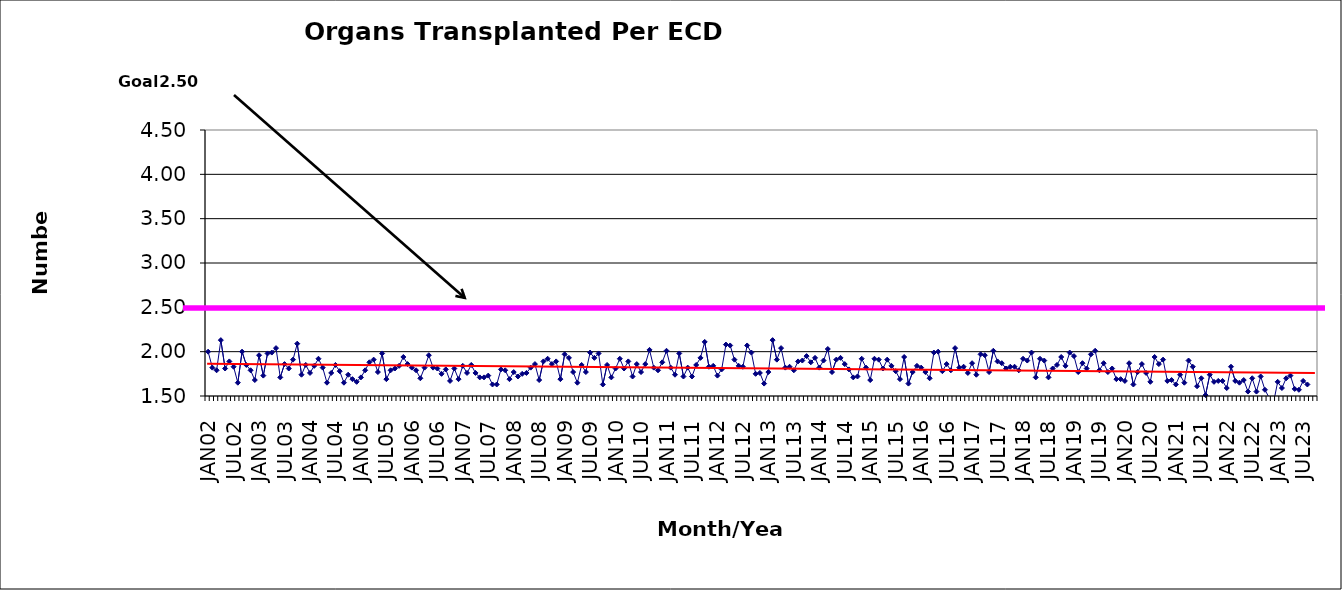
| Category | Series 0 |
|---|---|
| JAN02 | 2 |
| FEB02 | 1.82 |
| MAR02 | 1.79 |
| APR02 | 2.13 |
| MAY02 | 1.81 |
| JUN02 | 1.89 |
| JUL02 | 1.83 |
| AUG02 | 1.65 |
| SEP02 | 2 |
| OCT02 | 1.85 |
| NOV02 | 1.79 |
| DEC02 | 1.68 |
| JAN03 | 1.96 |
| FEB03 | 1.73 |
| MAR03 | 1.98 |
| APR03 | 1.99 |
| MAY03 | 2.04 |
| JUN03 | 1.71 |
| JUL03 | 1.86 |
| AUG03 | 1.81 |
| SEP03 | 1.91 |
| OCT03 | 2.09 |
| NOV03 | 1.74 |
| DEC03 | 1.85 |
| JAN04 | 1.76 |
| FEB04 | 1.84 |
| MAR04 | 1.92 |
| APR04 | 1.82 |
| MAY04 | 1.65 |
| JUN04 | 1.76 |
| JUL04 | 1.85 |
| AUG04 | 1.78 |
| SEP04 | 1.65 |
| OCT04 | 1.74 |
| NOV04 | 1.69 |
| DEC04 | 1.66 |
| JAN05 | 1.71 |
| FEB05 | 1.79 |
| MAR05 | 1.88 |
| APR05 | 1.91 |
| MAY05 | 1.77 |
| JUN05 | 1.98 |
| JUL05 | 1.69 |
| AUG05 | 1.79 |
| SEP05 | 1.81 |
| OCT05 | 1.84 |
| NOV05 | 1.94 |
| DEC05 | 1.86 |
| JAN06 | 1.82 |
| FEB06 | 1.79 |
| MAR06 | 1.7 |
| APR06 | 1.82 |
| MAY06 | 1.96 |
| JUN06 | 1.82 |
| JUL06 | 1.81 |
| AUG06 | 1.75 |
| SEP06 | 1.8 |
| OCT06 | 1.67 |
| NOV06 | 1.81 |
| DEC06 | 1.69 |
| JAN07 | 1.84 |
| FEB07 | 1.76 |
| MAR07 | 1.85 |
| APR07 | 1.76 |
| MAY07 | 1.71 |
| JUN07 | 1.71 |
| JUL07 | 1.73 |
| AUG07 | 1.63 |
| SEP07 | 1.63 |
| OCT07 | 1.8 |
| NOV07 | 1.79 |
| DEC07 | 1.69 |
| JAN08 | 1.77 |
| FEB08 | 1.72 |
| MAR08 | 1.75 |
| APR08 | 1.76 |
| MAY08 | 1.82 |
| JUN08 | 1.86 |
| JUL08 | 1.68 |
| AUG08 | 1.89 |
| SEP08 | 1.92 |
| OCT08 | 1.86 |
| NOV08 | 1.89 |
| DEC08 | 1.69 |
| JAN09 | 1.97 |
| FEB09 | 1.93 |
| MAR09 | 1.77 |
| APR09 | 1.65 |
| MAY09 | 1.85 |
| JUN09 | 1.77 |
| JUL09 | 1.99 |
| AUG09 | 1.93 |
| SEP09 | 1.98 |
| OCT09 | 1.63 |
| NOV09 | 1.85 |
| DEC09 | 1.71 |
| JAN10 | 1.81 |
| FEB10 | 1.92 |
| MAR10 | 1.81 |
| APR10 | 1.89 |
| MAY10 | 1.72 |
| JUN10 | 1.86 |
| JUL10 | 1.77 |
| AUG10 | 1.86 |
| SEP10 | 2.02 |
| OCT10 | 1.82 |
| NOV10 | 1.79 |
| DEC10 | 1.88 |
| JAN11 | 2.01 |
| FEB11 | 1.82 |
| MAR11 | 1.74 |
| APR11 | 1.98 |
| MAY11 | 1.72 |
| JUN11 | 1.82 |
| JUL11 | 1.72 |
| AUG11 | 1.85 |
| SEP11 | 1.93 |
| OCT11 | 2.11 |
| NOV11 | 1.83 |
| DEC11 | 1.84 |
| JAN12 | 1.73 |
| FEB12 | 1.8 |
| MAR12 | 2.08 |
| APR12 | 2.07 |
| MAY12 | 1.91 |
| JUN12 | 1.84 |
| JUL12 | 1.83 |
| AUG12 | 2.07 |
| SEP12 | 1.99 |
| OCT12 | 1.75 |
| NOV12 | 1.76 |
| DEC12 | 1.64 |
| JAN13 | 1.77 |
| FEB13 | 2.13 |
| MAR13 | 1.91 |
| APR13 | 2.04 |
| MAY13 | 1.82 |
| JUN13 | 1.83 |
| JUL13 | 1.79 |
| AUG13 | 1.89 |
| SEP13 | 1.9 |
| OCT13 | 1.95 |
| NOV13 | 1.88 |
| DEC13 | 1.93 |
| JAN14 | 1.82 |
| FEB14 | 1.9 |
| MAR14 | 2.03 |
| APR14 | 1.77 |
| MAY14 | 1.91 |
| JUN14 | 1.93 |
| JUL14 | 1.86 |
| AUG14 | 1.8 |
| SEP14 | 1.71 |
| OCT14 | 1.72 |
| NOV14 | 1.92 |
| DEC14 | 1.82 |
| JAN15 | 1.68 |
| FEB15 | 1.92 |
| MAR15 | 1.91 |
| APR15 | 1.81 |
| MAY15 | 1.91 |
| JUN15 | 1.84 |
| JUL15 | 1.78 |
| AUG15 | 1.69 |
| SEP15 | 1.94 |
| OCT15 | 1.64 |
| NOV15 | 1.77 |
| DEC15 | 1.84 |
| JAN16 | 1.82 |
| FEB16 | 1.77 |
| MAR16 | 1.7 |
| APR16 | 1.99 |
| MAY16 | 2 |
| JUN16 | 1.78 |
| JUL16 | 1.86 |
| AUG16 | 1.79 |
| SEP16 | 2.04 |
| OCT16 | 1.82 |
| NOV16 | 1.83 |
| DEC16 | 1.76 |
| JAN17 | 1.87 |
| FEB17 | 1.74 |
| MAR17 | 1.97 |
| APR17 | 1.96 |
| MAY17 | 1.77 |
| JUN17 | 2.01 |
| JUL17 | 1.89 |
| AUG17 | 1.87 |
| SEP17 | 1.81 |
| OCT17 | 1.83 |
| NOV17 | 1.83 |
| DEC17 | 1.79 |
| JAN18 | 1.92 |
| FEB18 | 1.9 |
| MAR18 | 1.99 |
| APR18 | 1.71 |
| MAY18 | 1.92 |
| JUN18 | 1.9 |
| JUL18 | 1.71 |
| AUG18 | 1.81 |
| SEP18 | 1.85 |
| OCT18 | 1.94 |
| NOV18 | 1.84 |
| DEC18 | 1.99 |
| JAN19 | 1.95 |
| FEB19 | 1.77 |
| MAR19 | 1.87 |
| APR19 | 1.81 |
| MAY19 | 1.97 |
| JUN19 | 2.01 |
| JUL19 | 1.79 |
| AUG19 | 1.87 |
| SEP19 | 1.77 |
| OCT19 | 1.81 |
| NOV19 | 1.69 |
| DEC19 | 1.69 |
| JAN20 | 1.67 |
| FEB20 | 1.87 |
| MAR20 | 1.63 |
| APR20 | 1.77 |
| MAY20 | 1.86 |
| JUN20 | 1.76 |
| JUL20 | 1.66 |
| AUG20 | 1.94 |
| SEP20 | 1.86 |
| OCT20 | 1.91 |
| NOV20 | 1.67 |
| DEC20 | 1.68 |
| JAN21 | 1.63 |
| FEB21 | 1.74 |
| MAR21 | 1.65 |
| APR21 | 1.9 |
| MAY21 | 1.83 |
| JUN21 | 1.61 |
| JUL21 | 1.7 |
| AUG21 | 1.51 |
| SEP21 | 1.74 |
| OCT21 | 1.66 |
| NOV21 | 1.67 |
| DEC21 | 1.67 |
| JAN22 | 1.59 |
| FEB22 | 1.83 |
| MAR22 | 1.67 |
| APR22 | 1.65 |
| MAY22 | 1.68 |
| JUN22 | 1.55 |
| JUL22 | 1.7 |
| AUG22 | 1.55 |
| SEP22 | 1.72 |
| OCT22 | 1.57 |
| NOV22 | 1.48 |
| DEC22 | 1.42 |
| JAN23 | 1.66 |
| FEB23 | 1.59 |
| MAR23 | 1.7 |
| APR23 | 1.73 |
| MAY23 | 1.58 |
| JUN23 | 1.57 |
| JUL23 | 1.67 |
| AUG23 | 1.63 |